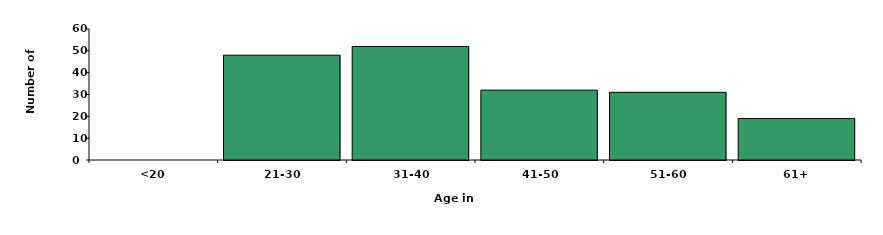
| Category | Series 0 |
|---|---|
| <20 | 0 |
| 21-30 | 48 |
| 31-40 | 52 |
| 41-50 | 32 |
| 51-60 | 31 |
| 61+ | 19 |